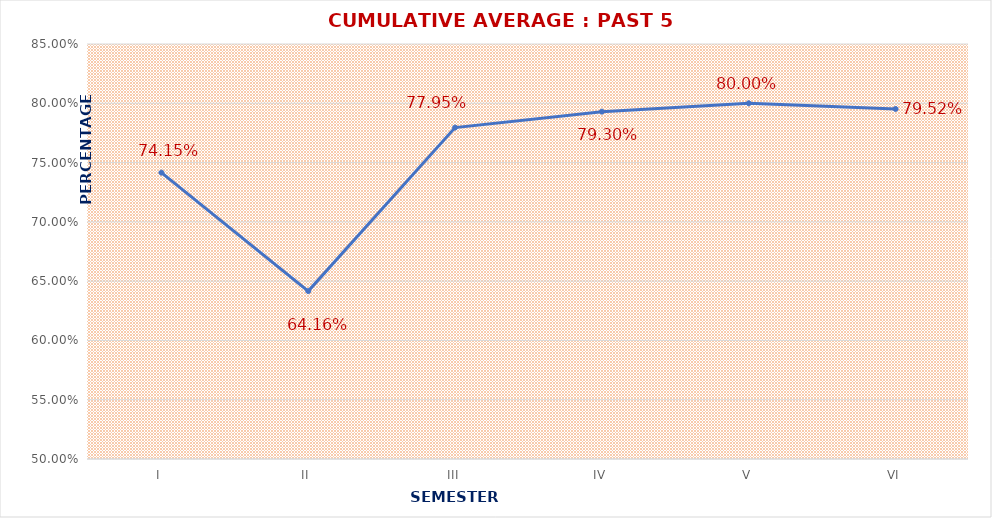
| Category | CUMULATIVE AVERAGE : PAST 5 YEARS |
|---|---|
| I | 0.742 |
| II | 0.642 |
| III | 0.78 |
| IV | 0.793 |
| V | 0.8 |
| VI | 0.795 |